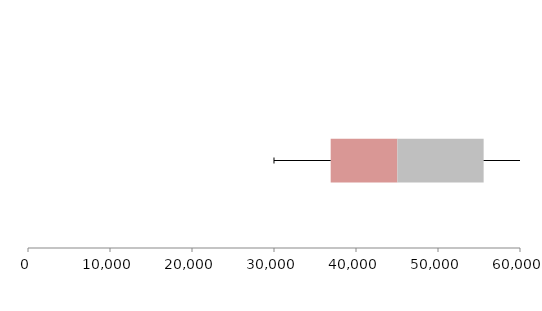
| Category | Series 1 | Series 2 | Series 3 |
|---|---|---|---|
| 0 | 36913.576 | 8134.303 | 10517.505 |